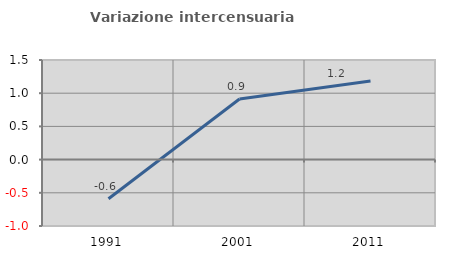
| Category | Variazione intercensuaria annua |
|---|---|
| 1991.0 | -0.589 |
| 2001.0 | 0.912 |
| 2011.0 | 1.185 |